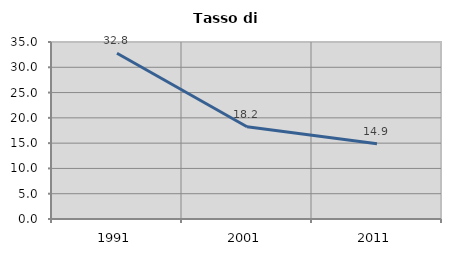
| Category | Tasso di disoccupazione   |
|---|---|
| 1991.0 | 32.766 |
| 2001.0 | 18.245 |
| 2011.0 | 14.886 |